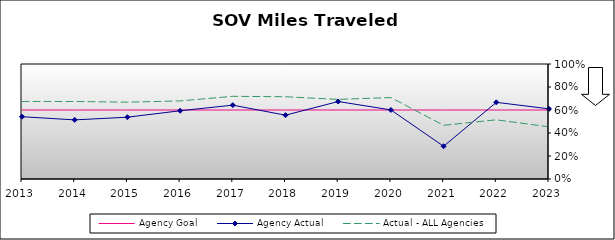
| Category | Agency Goal | Agency Actual | Actual - ALL Agencies |
|---|---|---|---|
| 2013.0 | 0.6 | 0.542 | 0.674 |
| 2014.0 | 0.6 | 0.514 | 0.674 |
| 2015.0 | 0.6 | 0.537 | 0.668 |
| 2016.0 | 0.6 | 0.593 | 0.679 |
| 2017.0 | 0.6 | 0.642 | 0.719 |
| 2018.0 | 0.6 | 0.555 | 0.715 |
| 2019.0 | 0.6 | 0.674 | 0.692 |
| 2020.0 | 0.6 | 0.601 | 0.708 |
| 2021.0 | 0.6 | 0.285 | 0.467 |
| 2022.0 | 0.6 | 0.667 | 0.515 |
| 2023.0 | 0.6 | 0.61 | 0.454 |